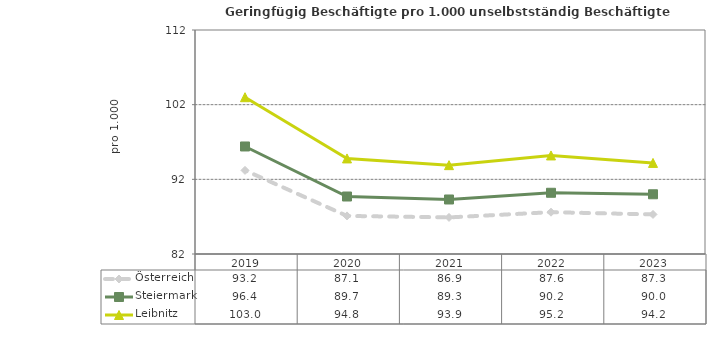
| Category | Österreich | Steiermark | Leibnitz |
|---|---|---|---|
| 2023.0 | 87.3 | 90 | 94.2 |
| 2022.0 | 87.6 | 90.2 | 95.2 |
| 2021.0 | 86.9 | 89.3 | 93.9 |
| 2020.0 | 87.1 | 89.7 | 94.8 |
| 2019.0 | 93.2 | 96.4 | 103 |